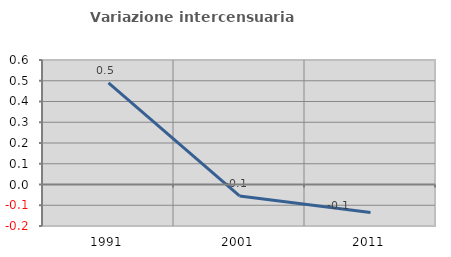
| Category | Variazione intercensuaria annua |
|---|---|
| 1991.0 | 0.489 |
| 2001.0 | -0.055 |
| 2011.0 | -0.135 |